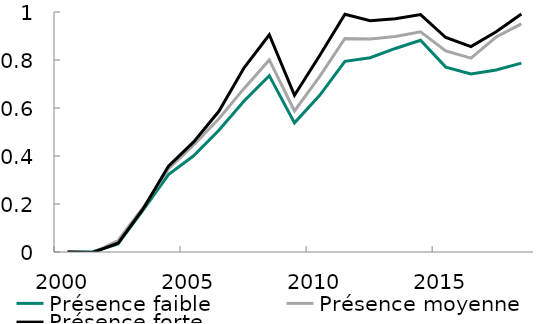
| Category | Présence faible | Présence moyenne | Présence forte |
|---|---|---|---|
| 2000.0 | 0 | 0 | 0 |
| 2001.0 | 0.001 | -0.005 | -0.002 |
| 2002.0 | 0.034 | 0.048 | 0.036 |
| 2003.0 | 0.176 | 0.186 | 0.18 |
| 2004.0 | 0.323 | 0.346 | 0.358 |
| 2005.0 | 0.401 | 0.446 | 0.459 |
| 2006.0 | 0.507 | 0.555 | 0.586 |
| 2007.0 | 0.629 | 0.682 | 0.767 |
| 2008.0 | 0.735 | 0.8 | 0.905 |
| 2009.0 | 0.538 | 0.588 | 0.653 |
| 2010.0 | 0.653 | 0.732 | 0.819 |
| 2011.0 | 0.794 | 0.89 | 0.99 |
| 2012.0 | 0.809 | 0.888 | 0.964 |
| 2013.0 | 0.848 | 0.898 | 0.972 |
| 2014.0 | 0.882 | 0.918 | 0.99 |
| 2015.0 | 0.77 | 0.838 | 0.894 |
| 2016.0 | 0.742 | 0.808 | 0.856 |
| 2017.0 | 0.758 | 0.896 | 0.918 |
| 2018.0 | 0.787 | 0.951 | 0.992 |